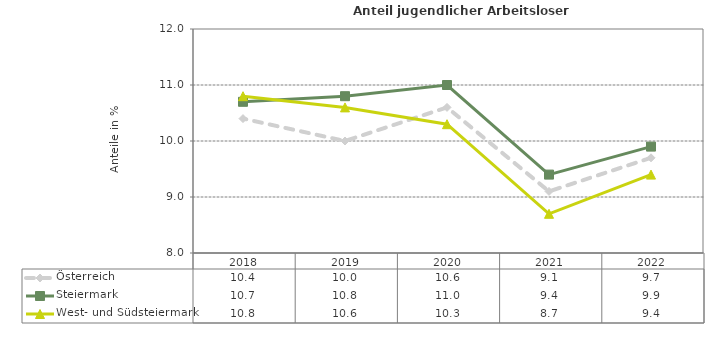
| Category | Österreich | Steiermark | West- und Südsteiermark |
|---|---|---|---|
| 2022.0 | 9.7 | 9.9 | 9.4 |
| 2021.0 | 9.1 | 9.4 | 8.7 |
| 2020.0 | 10.6 | 11 | 10.3 |
| 2019.0 | 10 | 10.8 | 10.6 |
| 2018.0 | 10.4 | 10.7 | 10.8 |